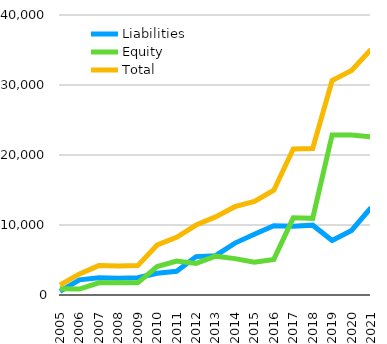
| Category | Liabilities  | Equity  | Total  |
|---|---|---|---|
| 2005 | 524 | 889 | 1413 |
| 2006 | 2161 | 847 | 3008 |
| 2007 | 2464 | 1734 | 4198 |
| 2008 | 2404 | 1734 | 4138 |
| 2009 | 2465 | 1734 | 4199 |
| 2010 | 3098 | 4057 | 7155 |
| 2011 | 3395 | 4851 | 8246 |
| 2012 | 5487 | 4510 | 9997 |
| 2013 | 5612 | 5548 | 11160 |
| 2014 | 7417 | 5199 | 12616 |
| 2015 | 8683 | 4681 | 13364 |
| 2016 | 9882 | 5088 | 14970 |
| 2017 | 9830 | 11026 | 20856 |
| 2018 | 9977 | 10950 | 20927 |
| 2019 | 7796 | 22854 | 30650 |
| 2020 | 9217 | 22854 | 32071 |
| 2021 | 12466.5 | 22601.4 | 35067.9 |